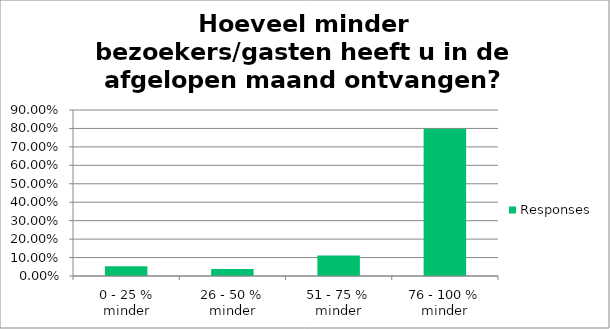
| Category | Responses |
|---|---|
| 0 - 25 % minder | 0.053 |
| 26 - 50 % minder | 0.038 |
| 51 - 75 % minder | 0.111 |
| 76 - 100 % minder | 0.798 |